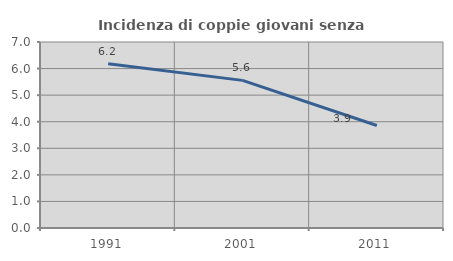
| Category | Incidenza di coppie giovani senza figli |
|---|---|
| 1991.0 | 6.182 |
| 2001.0 | 5.556 |
| 2011.0 | 3.857 |